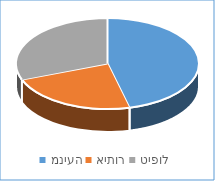
| Category | Series 0 |
|---|---|
| מניעה | 6 |
| איתור | 3 |
| טיפול | 4 |